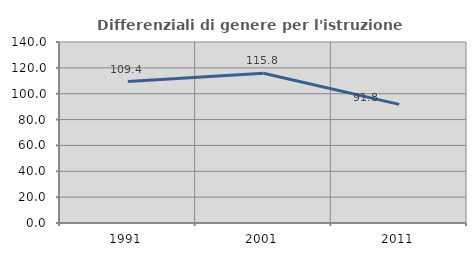
| Category | Differenziali di genere per l'istruzione superiore |
|---|---|
| 1991.0 | 109.406 |
| 2001.0 | 115.833 |
| 2011.0 | 91.768 |